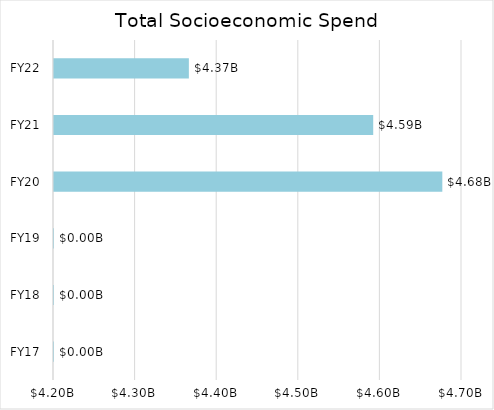
| Category | Series 0 |
|---|---|
| FY17 | 0 |
| FY18 | 0 |
| FY19 | 0 |
| FY20 | 4675884239.531 |
| FY21 | 4591189388.591 |
| FY22 | 4365277562 |